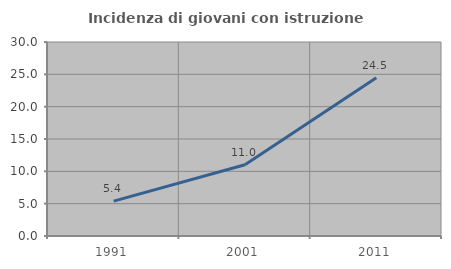
| Category | Incidenza di giovani con istruzione universitaria |
|---|---|
| 1991.0 | 5.387 |
| 2001.0 | 11.02 |
| 2011.0 | 24.49 |